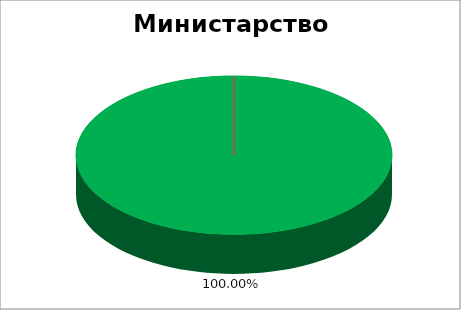
| Category | Министарство здравља |
|---|---|
| 0 | 1 |
| 1 | 0 |
| 2 | 0 |
| 3 | 0 |
| 4 | 0 |